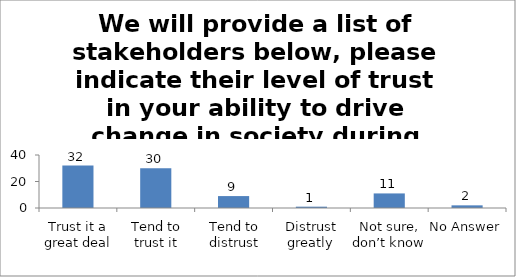
| Category | We will provide a list of stakeholders below, please indicate their level of trust in your ability to drive change in society during studies. (Religious Leaders) |
|---|---|
| Trust it a great deal | 32 |
| Tend to trust it | 30 |
| Tend to distrust | 9 |
| Distrust greatly | 1 |
| Not sure, don’t know | 11 |
| No Answer | 2 |